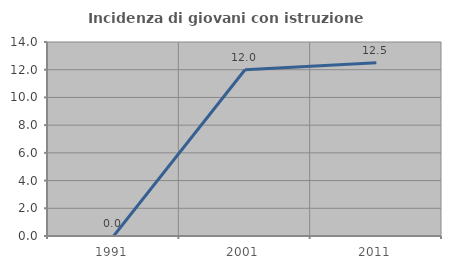
| Category | Incidenza di giovani con istruzione universitaria |
|---|---|
| 1991.0 | 0 |
| 2001.0 | 12 |
| 2011.0 | 12.5 |